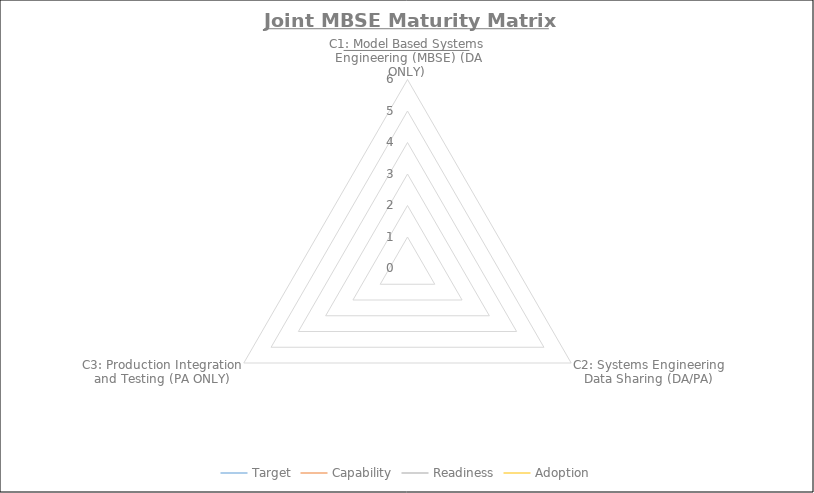
| Category | Target | Capability | Readiness | Adoption |
|---|---|---|---|---|
| C1: Model Based Systems Engineering (MBSE) (DA ONLY) | 0 | 0 | 0 | 0 |
| C2: Systems Engineering Data Sharing (DA/PA) | 0 | 0 | 0 | 0 |
| C3: Production Integration and Testing (PA ONLY) | 0 | 0 | 0 | 0 |